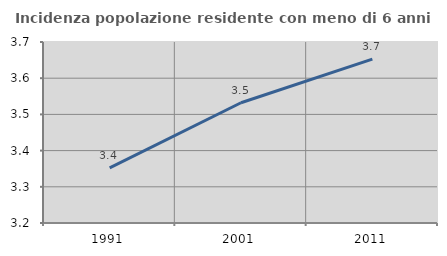
| Category | Incidenza popolazione residente con meno di 6 anni |
|---|---|
| 1991.0 | 3.352 |
| 2001.0 | 3.532 |
| 2011.0 | 3.653 |